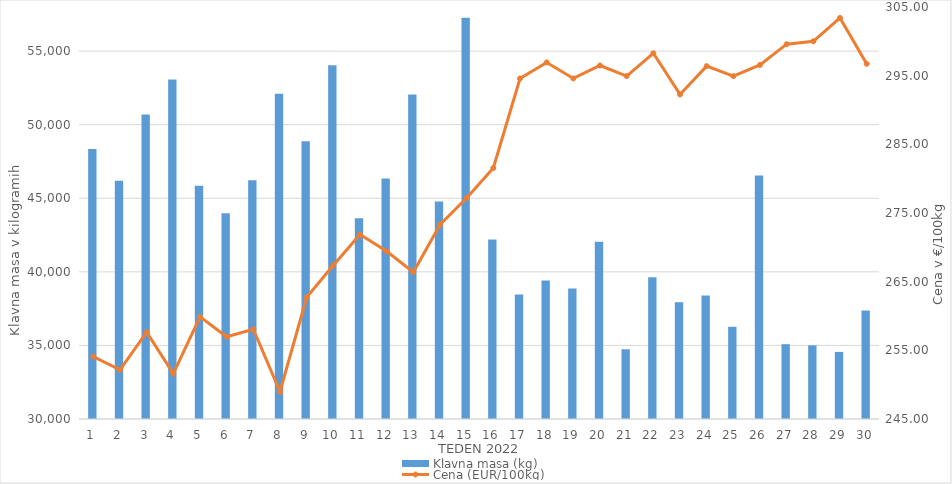
| Category | Klavna masa (kg) |
|---|---|
| 1.0 | 48349 |
| 2.0 | 46187 |
| 3.0 | 50692 |
| 4.0 | 53081 |
| 5.0 | 45844 |
| 6.0 | 43982 |
| 7.0 | 46227 |
| 8.0 | 52099 |
| 9.0 | 48872 |
| 10.0 | 54045 |
| 11.0 | 43645 |
| 12.0 | 46350 |
| 13.0 | 52061 |
| 14.0 | 44774 |
| 15.0 | 57268 |
| 16.0 | 42191 |
| 17.0 | 38469 |
| 18.0 | 39417 |
| 19.0 | 38876 |
| 20.0 | 42047 |
| 21.0 | 34739 |
| 22.0 | 39626 |
| 23.0 | 37939 |
| 24.0 | 38390 |
| 25.0 | 36272 |
| 26.0 | 46553 |
| 27.0 | 35085 |
| 28.0 | 35007 |
| 29.0 | 34559 |
| 30.0 | 37366 |